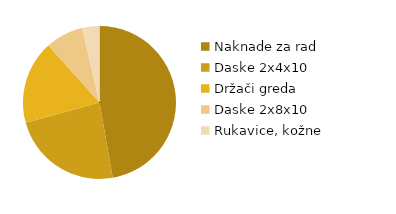
| Category | Series 0 |
|---|---|
| Naknade za rad | 200 |
| Daske 2x4x10 | 99.4 |
| Držači greda | 74.7 |
| Daske 2x8x10 | 33.75 |
| Rukavice, kožne | 15.5 |